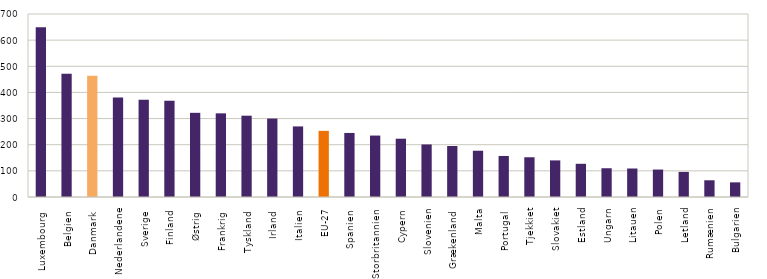
| Category | 2012 |
|---|---|
| Luxembourg  | 649 |
| Belgien  | 471 |
| Danmark  | 464 |
| Nederlandene | 381 |
| Sverige  | 372 |
| Finland  | 368 |
| Østrig  | 322 |
| Frankrig  | 320 |
| Tyskland  | 311 |
| Irland  | 300 |
| Italien  | 270 |
| EU-27 | 253 |
| Spanien  | 245 |
| Storbritannien  | 235 |
| Cypern | 223 |
| Slovenien | 201 |
| Grækenland  | 195 |
| Malta | 177 |
| Portugal  | 157 |
| Tjekkiet | 152 |
| Slovakiet | 140 |
| Estland | 127 |
| Ungarn | 110 |
| Litauen | 109 |
| Polen | 105 |
| Letland | 96 |
| Rumænien | 64 |
| Bulgarien | 56 |